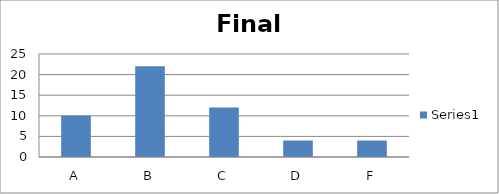
| Category | Series 0 |
|---|---|
| A | 10 |
| B | 22 |
| C | 12 |
| D | 4 |
| F | 4 |